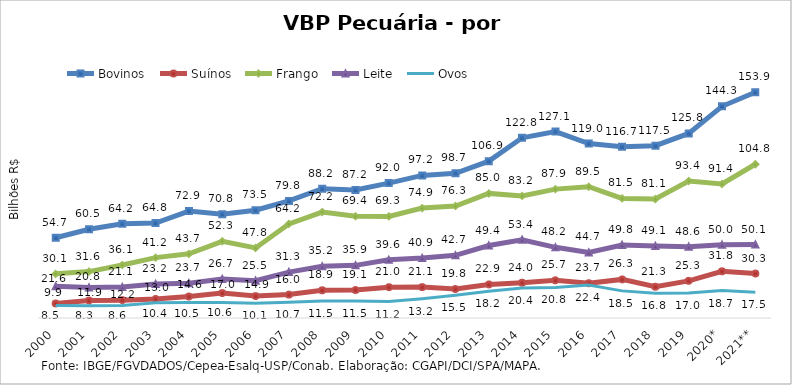
| Category | Bovinos | Suínos | Frango | Leite | Ovos |
|---|---|---|---|---|---|
| 2000 | 54.719 | 9.908 | 30.109 | 21.613 | 8.451 |
| 2001 | 60.486 | 11.886 | 31.647 | 20.798 | 8.327 |
| 2002 | 64.187 | 12.183 | 36.124 | 21.06 | 8.58 |
| 2003 | 64.782 | 13.02 | 41.184 | 23.191 | 10.378 |
| 2004 | 72.887 | 14.639 | 43.732 | 23.703 | 10.518 |
| 2005 | 70.763 | 16.972 | 52.285 | 26.659 | 10.59 |
| 2006 | 73.469 | 14.929 | 47.765 | 25.464 | 10.059 |
| 2007 | 79.844 | 15.964 | 64.176 | 31.304 | 10.691 |
| 2008 | 88.157 | 18.903 | 72.242 | 35.215 | 11.546 |
| 2009 | 87.238 | 19.108 | 69.362 | 35.902 | 11.512 |
| 2010 | 91.975 | 21.021 | 69.278 | 39.649 | 11.197 |
| 2011 | 97.232 | 21.054 | 74.928 | 40.873 | 13.194 |
| 2012 | 98.681 | 19.769 | 76.327 | 42.711 | 15.466 |
| 2013 | 106.936 | 22.889 | 84.952 | 49.425 | 18.19 |
| 2014 | 122.849 | 24.041 | 83.234 | 53.372 | 20.437 |
| 2015 | 127.077 | 25.692 | 87.869 | 48.178 | 20.809 |
| 2016 | 118.95 | 23.71 | 89.533 | 44.703 | 22.434 |
| 2017 | 116.729 | 26.321 | 81.549 | 49.809 | 18.491 |
| 2018 | 117.512 | 21.316 | 81.104 | 49.068 | 16.815 |
| 2019 | 125.829 | 25.337 | 93.383 | 48.614 | 17.029 |
| 2020* | 144.334 | 31.848 | 91.363 | 49.982 | 18.702 |
| 2021** | 153.923 | 30.323 | 104.831 | 50.109 | 17.521 |